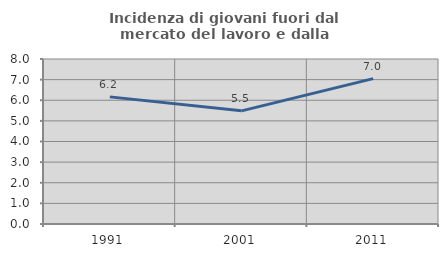
| Category | Incidenza di giovani fuori dal mercato del lavoro e dalla formazione  |
|---|---|
| 1991.0 | 6.164 |
| 2001.0 | 5.486 |
| 2011.0 | 7.049 |